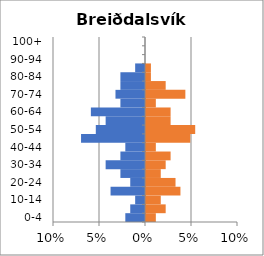
| Category | % Men | % Women |
|---|---|---|
| 0-4 | -0.021 | 0.011 |
| 5-9 | -0.016 | 0.021 |
| 10-14 | -0.011 | 0.016 |
| 15-19 | -0.037 | 0.037 |
| 20-24 | -0.016 | 0.032 |
| 25-29 | -0.027 | 0.016 |
| 30-34 | -0.043 | 0.021 |
| 35-39 | -0.027 | 0.027 |
| 40-44 | -0.021 | 0.011 |
| 45-49 | -0.07 | 0.048 |
| 50-54 | -0.053 | 0.053 |
| 55-59 | -0.043 | 0.027 |
| 60-64 | -0.059 | 0.027 |
| 65-69 | -0.027 | 0.011 |
| 70-74 | -0.032 | 0.043 |
| 75-79 | -0.027 | 0.021 |
| 80-84 | -0.027 | 0.005 |
| 85-89 | -0.011 | 0.005 |
| 90-94 | 0 | 0 |
| 95-99 | 0 | 0 |
| 100+ | 0 | 0 |